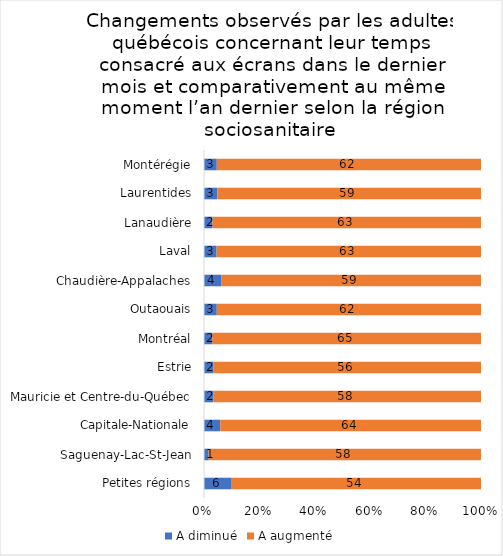
| Category | A diminué | A augmenté |
|---|---|---|
| Petites régions | 6 | 54 |
| Saguenay-Lac-St-Jean | 1 | 58 |
| Capitale-Nationale | 4 | 64 |
| Mauricie et Centre-du-Québec | 2 | 58 |
| Estrie | 2 | 56 |
| Montréal | 2 | 65 |
| Outaouais | 3 | 62 |
| Chaudière-Appalaches | 4 | 59 |
| Laval | 3 | 63 |
| Lanaudière | 2 | 63 |
| Laurentides | 3 | 59 |
| Montérégie | 3 | 62 |